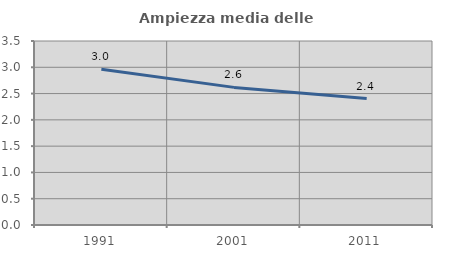
| Category | Ampiezza media delle famiglie |
|---|---|
| 1991.0 | 2.963 |
| 2001.0 | 2.618 |
| 2011.0 | 2.405 |